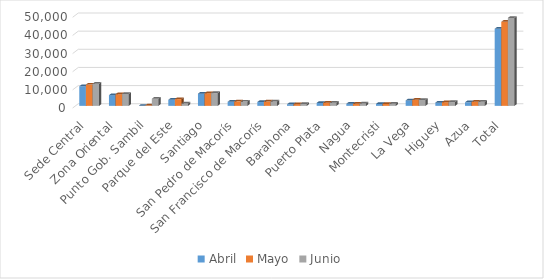
| Category | Abril | Mayo | Junio |
|---|---|---|---|
| Sede Central | 10790 | 11717 | 12145 |
| Zona Oriental | 5887 | 6411 | 6553 |
| Punto Gob. Sambil | 0 | 199 | 3892 |
| Parque del Este | 3329 | 3726 | 1270 |
| Santiago | 6713 | 6969 | 7047 |
| San Pedro de Macorís | 2240 | 2485 | 2336 |
| San Francisco de Macorís | 2106 | 2374 | 2407 |
| Barahona | 882 | 951 | 1005 |
| Puerto Plata | 1618 | 1694 | 1696 |
| Nagua | 1146 | 1124 | 1356 |
| Montecristi | 1068 | 1081 | 1152 |
| La Vega | 2973 | 3335 | 3281 |
| Higuey | 1764 | 2018 | 2101 |
| Azua | 1961 | 2244 | 2225 |
| Total | 42477 | 46328 | 48466 |